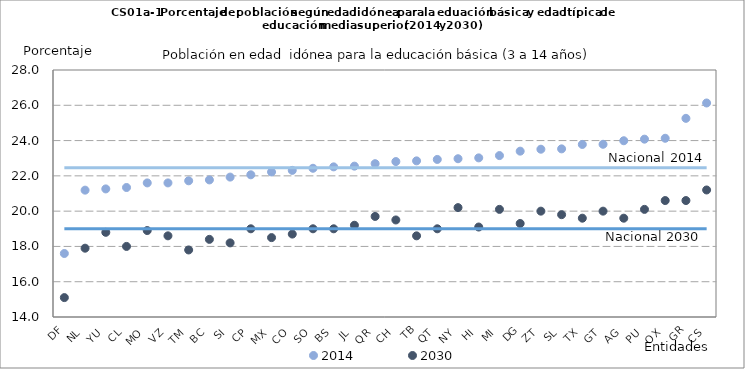
| Category | 2014 | 2030 | N_14 | N_30 |
|---|---|---|---|---|
| DF | 17.6 | 15.1 | 22.46 | 19 |
| NL | 21.19 | 17.9 | 22.46 | 19 |
| YU | 21.26 | 18.8 | 22.46 | 19 |
| CL | 21.34 | 18 | 22.46 | 19 |
| MO | 21.6 | 18.9 | 22.46 | 19 |
| VZ | 21.6 | 18.6 | 22.46 | 19 |
| TM | 21.72 | 17.8 | 22.46 | 19 |
| BC | 21.77 | 18.4 | 22.46 | 19 |
| SI | 21.93 | 18.2 | 22.46 | 19 |
| CP | 22.06 | 19 | 22.46 | 19 |
| MX | 22.22 | 18.5 | 22.46 | 19 |
| CO | 22.31 | 18.7 | 22.46 | 19 |
| SO | 22.43 | 19 | 22.46 | 19 |
| BS | 22.51 | 19 | 22.46 | 19 |
| JL | 22.55 | 19.2 | 22.46 | 19 |
| QR | 22.69 | 19.7 | 22.46 | 19 |
| CH | 22.81 | 19.5 | 22.46 | 19 |
| TB | 22.85 | 18.6 | 22.46 | 19 |
| QT | 22.93 | 19 | 22.46 | 19 |
| NY | 22.97 | 20.2 | 22.46 | 19 |
| HI | 23.02 | 19.1 | 22.46 | 19 |
| MI | 23.15 | 20.1 | 22.46 | 19 |
| DG | 23.4 | 19.3 | 22.46 | 19 |
| ZT | 23.51 | 20 | 22.46 | 19 |
| SL | 23.53 | 19.8 | 22.46 | 19 |
| TX | 23.78 | 19.6 | 22.46 | 19 |
| GT | 23.79 | 20 | 22.46 | 19 |
| AG | 23.99 | 19.6 | 22.46 | 19 |
| PU | 24.08 | 20.1 | 22.46 | 19 |
| OX | 24.13 | 20.6 | 22.46 | 19 |
| GR | 25.26 | 20.6 | 22.46 | 19 |
| CS | 26.13 | 21.2 | 22.46 | 19 |